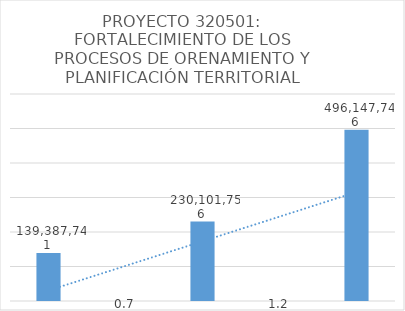
| Category | Series 0 |
|---|---|
| 0 | 139387741 |
| 1 | 0.651 |
| 2 | 230101756 |
| 3 | 1.156 |
| 4 | 496147746 |